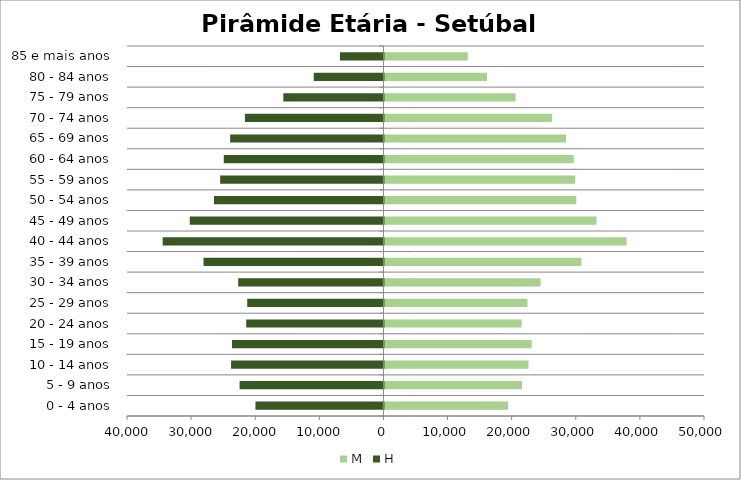
| Category | M | H |
|---|---|---|
| 0 - 4 anos | 19291 | -19964 |
| 5 - 9 anos | 21457 | -22439 |
| 10 - 14 anos | 22468 | -23767 |
| 15 - 19 anos | 22968 | -23624 |
| 20 - 24 anos | 21398 | -21404 |
| 25 - 29 anos | 22313 | -21246 |
| 30 - 34 anos | 24350 | -22659 |
| 35 - 39 anos | 30718 | -28066 |
| 40 - 44 anos | 37752 | -34437 |
| 45 - 49 anos | 33071 | -30206 |
| 50 - 54 anos | 29926 | -26435 |
| 55 - 59 anos | 29760 | -25468 |
| 60 - 64 anos | 29523 | -24903 |
| 65 - 69 anos | 28327 | -23914 |
| 70 - 74 anos | 26148 | -21607 |
| 75 - 79 anos | 20458 | -15618 |
| 80 - 84 anos | 15992 | -10870 |
| 85 e mais anos | 12995 | -6786 |